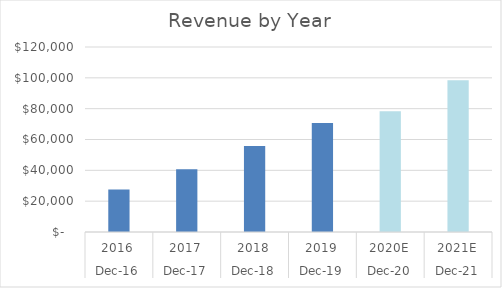
| Category | Series 0 |
|---|---|
| 0 | 27638 |
| 1 | 40653 |
| 2 | 55838 |
| 3 | 70697 |
| 4 | 78299.123 |
| 5 | 98426.395 |